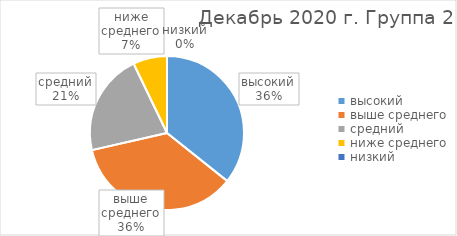
| Category | Series 0 |
|---|---|
| высокий | 5 |
| выше среднего | 5 |
| средний | 3 |
| ниже среднего | 1 |
| низкий | 0 |